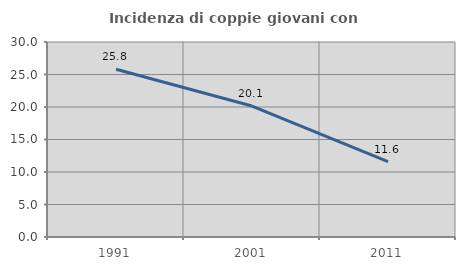
| Category | Incidenza di coppie giovani con figli |
|---|---|
| 1991.0 | 25.814 |
| 2001.0 | 20.144 |
| 2011.0 | 11.583 |